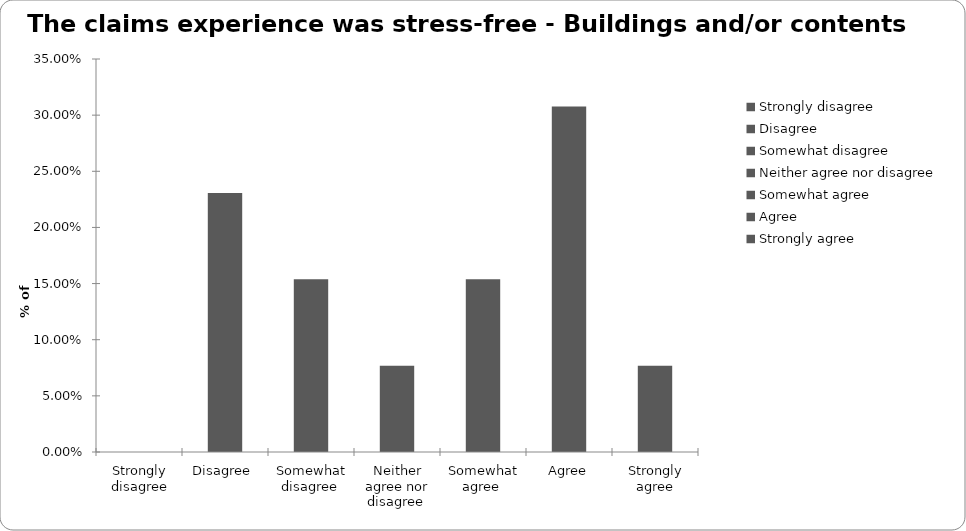
| Category | Series 1 |
|---|---|
| Strongly disagree | 0 |
| Disagree  | 0.231 |
| Somewhat disagree  | 0.154 |
| Neither agree nor disagree  | 0.077 |
| Somewhat agree  | 0.154 |
| Agree | 0.308 |
| Strongly agree | 0.077 |